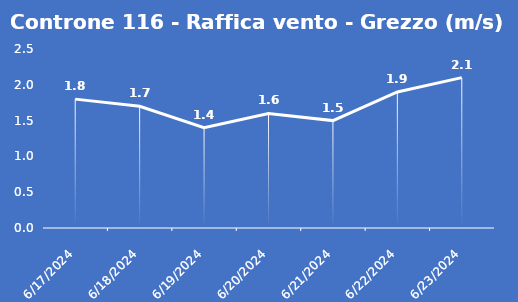
| Category | Controne 116 - Raffica vento - Grezzo (m/s) |
|---|---|
| 6/17/24 | 1.8 |
| 6/18/24 | 1.7 |
| 6/19/24 | 1.4 |
| 6/20/24 | 1.6 |
| 6/21/24 | 1.5 |
| 6/22/24 | 1.9 |
| 6/23/24 | 2.1 |